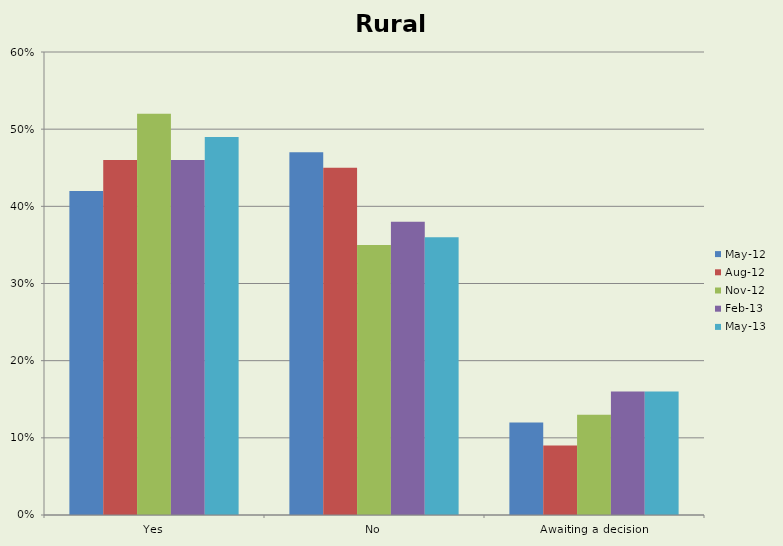
| Category | May-12 | Aug-12 | Nov-12 | Feb-13 | May-13 |
|---|---|---|---|---|---|
| Yes | 0.42 | 0.46 | 0.52 | 0.46 | 0.49 |
| No | 0.47 | 0.45 | 0.35 | 0.38 | 0.36 |
| Awaiting a decision | 0.12 | 0.09 | 0.13 | 0.16 | 0.16 |